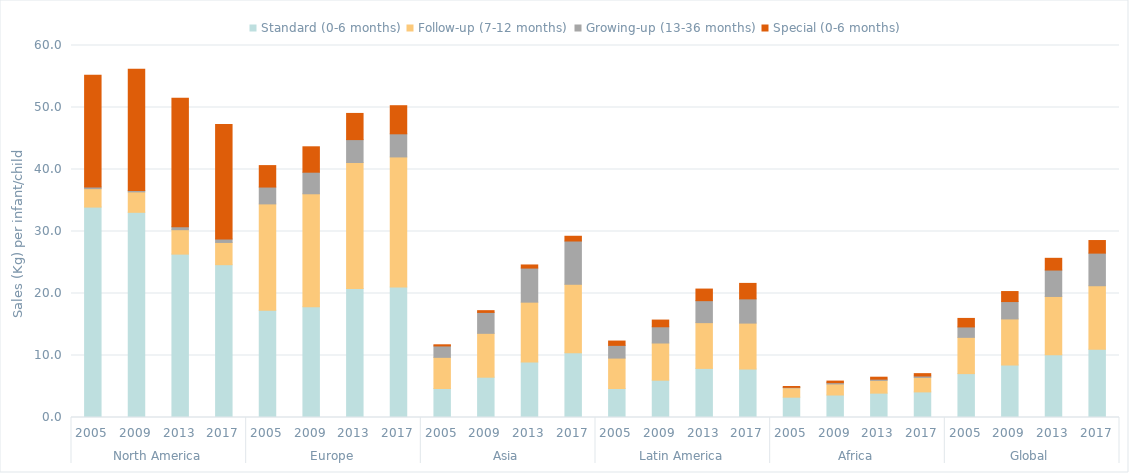
| Category | Standard (0-6 months) | Follow-up (7-12 months) | Growing-up (13-36 months) | Special (0-6 months) |
|---|---|---|---|---|
| 0 | 33.94 | 2.974 | 0.256 | 18.016 |
| 1 | 33.095 | 3.292 | 0.217 | 19.552 |
| 2 | 26.351 | 3.941 | 0.464 | 20.736 |
| 3 | 24.648 | 3.586 | 0.551 | 18.467 |
| 4 | 17.286 | 17.168 | 2.717 | 3.459 |
| 5 | 17.868 | 18.216 | 3.481 | 4.097 |
| 6 | 20.817 | 20.313 | 3.692 | 4.221 |
| 7 | 21.05 | 20.977 | 3.729 | 4.532 |
| 8 | 4.674 | 5.03 | 1.836 | 0.188 |
| 9 | 6.502 | 7.073 | 3.375 | 0.282 |
| 10 | 8.948 | 9.656 | 5.496 | 0.503 |
| 11 | 10.428 | 11.059 | 6.98 | 0.765 |
| 12 | 4.681 | 4.903 | 2.052 | 0.694 |
| 13 | 6.017 | 5.998 | 2.62 | 1.08 |
| 14 | 7.92 | 7.383 | 3.543 | 1.87 |
| 15 | 7.817 | 7.41 | 3.908 | 2.494 |
| 16 | 3.277 | 1.516 | 0.071 | 0.138 |
| 17 | 3.626 | 1.787 | 0.206 | 0.253 |
| 18 | 3.93 | 2.053 | 0.199 | 0.318 |
| 19 | 4.129 | 2.339 | 0.224 | 0.382 |
| 20 | 7.081 | 5.848 | 1.679 | 1.373 |
| 21 | 8.464 | 7.434 | 2.803 | 1.614 |
| 22 | 10.129 | 9.393 | 4.26 | 1.893 |
| 23 | 11.014 | 10.239 | 5.258 | 2.032 |